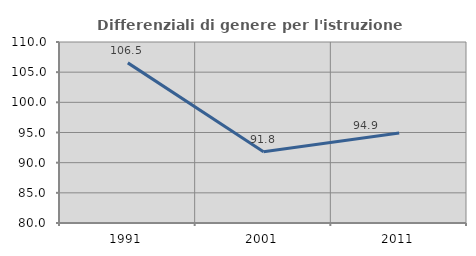
| Category | Differenziali di genere per l'istruzione superiore |
|---|---|
| 1991.0 | 106.539 |
| 2001.0 | 91.807 |
| 2011.0 | 94.924 |